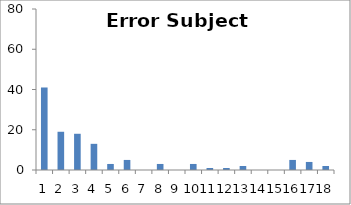
| Category | Sub11 |
|---|---|
| 0 | 41 |
| 1 | 19 |
| 2 | 18 |
| 3 | 13 |
| 4 | 3 |
| 5 | 5 |
| 6 | 0 |
| 7 | 3 |
| 8 | 0 |
| 9 | 3 |
| 10 | 1 |
| 11 | 1 |
| 12 | 2 |
| 13 | 0 |
| 14 | 0 |
| 15 | 5 |
| 16 | 4 |
| 17 | 2 |